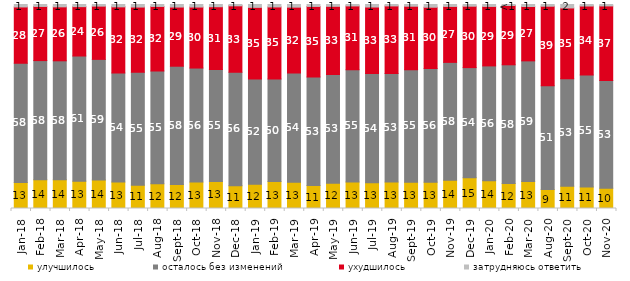
| Category | улучшилось | осталось без изменений | ухудшилось | затрудняюсь ответить |
|---|---|---|---|---|
| 2018-01-01 | 12.75 | 58.45 | 27.6 | 1.2 |
| 2018-02-01 | 14.1 | 58.4 | 26.55 | 0.95 |
| 2018-03-01 | 14.1 | 58.3 | 26.45 | 1.15 |
| 2018-04-01 | 13.35 | 61.4 | 24.2 | 1.05 |
| 2018-05-01 | 14 | 59.1 | 26.1 | 0.8 |
| 2018-06-01 | 12.95 | 53.5 | 32.4 | 1.15 |
| 2018-07-01 | 11.45 | 55.3 | 32 | 1.25 |
| 2018-08-01 | 12.1 | 55.25 | 31.7 | 0.95 |
| 2018-09-01 | 11.75 | 58 | 29 | 1.25 |
| 2018-10-01 | 12.95 | 55.9 | 29.9 | 1.25 |
| 2018-11-01 | 13.273 | 54.84 | 30.788 | 1.098 |
| 2018-12-01 | 11.2 | 55.6 | 32.55 | 0.65 |
| 2019-01-01 | 11.85 | 51.6 | 35.15 | 1.4 |
| 2019-02-01 | 13.2 | 50.3 | 35.3 | 1.2 |
| 2019-03-01 | 12.929 | 53.506 | 32.273 | 1.293 |
| 2019-04-01 | 11.238 | 53.168 | 34.653 | 0.941 |
| 2019-05-01 | 12.432 | 53.244 | 33.432 | 0.892 |
| 2019-06-01 | 13.017 | 54.963 | 31.322 | 0.698 |
| 2019-07-01 | 12.624 | 53.564 | 32.574 | 1.238 |
| 2019-08-01 | 12.937 | 53.197 | 33.167 | 0.699 |
| 2019-09-01 | 12.871 | 55.149 | 31.139 | 0.842 |
| 2019-10-01 | 12.921 | 55.693 | 30.05 | 1.337 |
| 2019-11-01 | 13.861 | 57.772 | 27.426 | 0.941 |
| 2019-12-01 | 15.099 | 53.96 | 30.099 | 0.842 |
| 2020-01-01 | 13.663 | 56.238 | 29.158 | 0.941 |
| 2020-02-01 | 12.228 | 58.218 | 29.059 | 0.495 |
| 2020-03-01 | 13.188 | 59.147 | 26.624 | 0.992 |
| 2020-08-01 | 9.285 | 50.943 | 38.928 | 0.844 |
| 2020-09-01 | 10.951 | 52.713 | 34.644 | 1.692 |
| 2020-10-01 | 10.563 | 54.858 | 33.832 | 0.747 |
| 2020-11-01 | 9.95 | 52.85 | 36.5 | 0.7 |